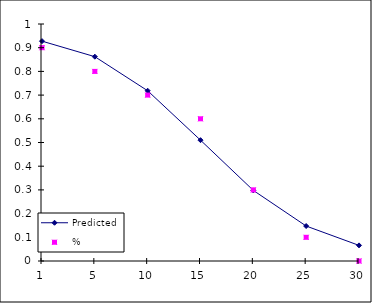
| Category | Predicted | % |
|---|---|---|
| 1.0 | 0.928 | 0.9 |
| 5.0 | 0.862 | 0.8 |
| 10.0 | 0.718 | 0.7 |
| 15.0 | 0.51 | 0.6 |
| 20.0 | 0.298 | 0.3 |
| 25.0 | 0.147 | 0.1 |
| 30.0 | 0.066 | 0 |